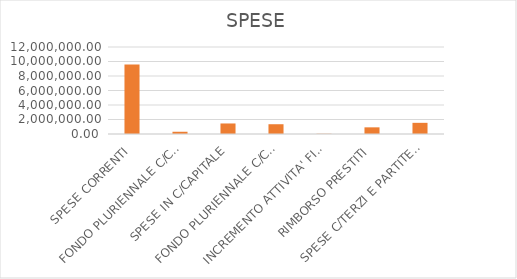
| Category | Series 0 |
|---|---|
| SPESE CORRENTI | 9570471.15 |
| FONDO PLURIENNALE C/CORRENTE | 310018.09 |
| SPESE IN C/CAPITALE | 1452458.78 |
| FONDO PLURIENNALE C/CAPITALE | 1347925.35 |
| INCREMENTO ATTIVITA' FINANZIARIE | 32200 |
| RIMBORSO PRESTITI | 918228.12 |
| SPESE C/TERZI E PARTITE DI GIRO | 1540143.56 |